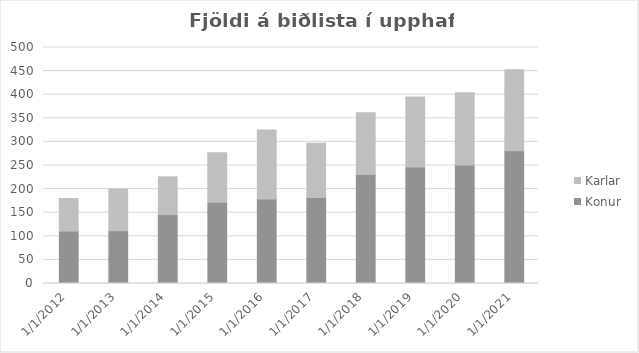
| Category | Konur | Karlar |
|---|---|---|
| 1/1/12 | 111 | 69 |
| 1/1/13 | 112 | 88 |
| 1/1/14 | 146 | 80 |
| 1/1/15 | 172 | 105 |
| 1/1/16 | 179 | 146 |
| 1/1/17 | 182 | 115 |
| 1/1/18 | 231 | 131 |
| 1/1/19 | 247 | 148 |
| 1/1/20 | 251 | 153 |
| 1/1/21 | 281 | 172 |